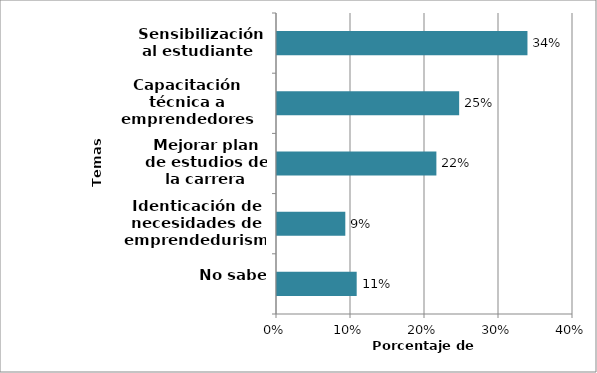
| Category | Series 0 |
|---|---|
| No sabe | 0.108 |
| Identicación de necesidades de emprendedurismo | 0.092 |
| Mejorar plan de estudios de la carrera | 0.215 |
| Capacitación técnica a emprendedores | 0.246 |
| Sensibilización al estudiante  | 0.338 |